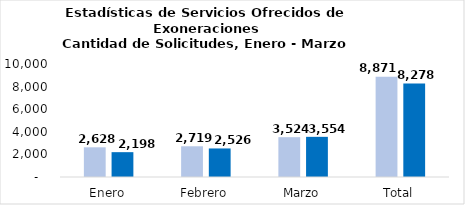
| Category | Tramitadas |
|---|---|
| Enero | 2198 |
| Febrero | 2526 |
| Marzo | 3554 |
| Total | 8278 |